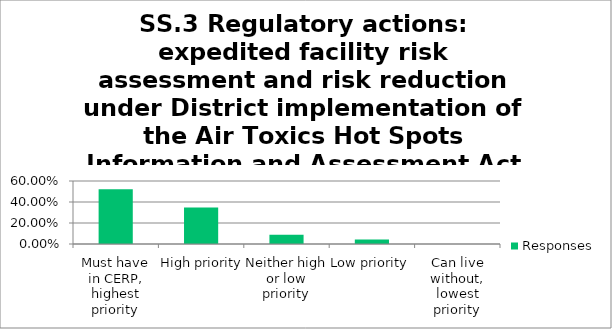
| Category | Responses |
|---|---|
| Must have in CERP, highest priority | 0.522 |
| High priority | 0.348 |
| Neither high or low priority | 0.087 |
| Low priority | 0.044 |
| Can live without, lowest priority | 0 |